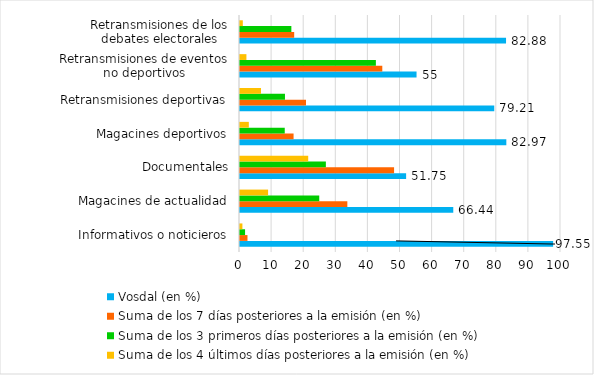
| Category | Vosdal (en %) | Suma de los 7 días posteriores a la emisión (en %) | Suma de los 3 primeros días posteriores a la emisión (en %) | Suma de los 4 últimos días posteriores a la emisión (en %) |
|---|---|---|---|---|
| Informativos o noticieros | 97.55 | 2.33 | 1.58 | 0.75 |
| Magacines de actualidad | 66.44 | 33.44 | 24.69 | 8.75 |
| Documentales | 51.75 | 48 | 26.75 | 21.25 |
| Magacines deportivos | 82.97 | 16.69 | 13.94 | 2.75 |
| Retransmisiones deportivas | 79.21 | 20.56 | 14.01 | 6.54 |
| Retransmisiones de eventos no deportivos | 55 | 44.33 | 42.33 | 2 |
| Retransmisiones de los debates electorales | 82.88 | 16.88 | 16 | 0.88 |